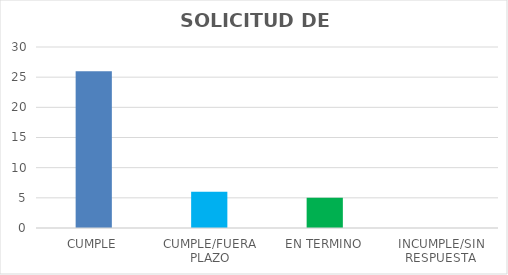
| Category | TOTAL |
|---|---|
| CUMPLE | 26 |
| CUMPLE/FUERA PLAZO | 6 |
| EN TERMINO | 5 |
| INCUMPLE/SIN RESPUESTA | 0 |